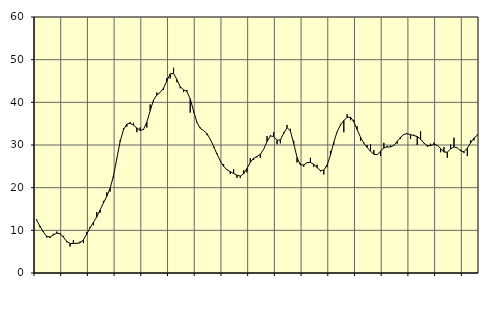
| Category | Piggar | Series 1 |
|---|---|---|
| nan | 12.6 | 12.34 |
| 87.0 | 10.7 | 10.99 |
| 87.0 | 9.8 | 9.62 |
| 87.0 | 8.3 | 8.6 |
| nan | 8.2 | 8.44 |
| 88.0 | 9.2 | 8.91 |
| 88.0 | 9.7 | 9.34 |
| 88.0 | 9.1 | 9.24 |
| nan | 8.7 | 8.41 |
| 89.0 | 7.2 | 7.41 |
| 89.0 | 6.2 | 6.91 |
| 89.0 | 7.7 | 6.91 |
| nan | 6.8 | 6.97 |
| 90.0 | 7.4 | 7.05 |
| 90.0 | 7 | 7.78 |
| 90.0 | 9.6 | 9.13 |
| nan | 10.8 | 10.58 |
| 91.0 | 11.2 | 11.87 |
| 91.0 | 14.3 | 13.16 |
| 91.0 | 14.1 | 14.77 |
| nan | 16.9 | 16.41 |
| 92.0 | 18.9 | 17.96 |
| 92.0 | 19.1 | 19.85 |
| 92.0 | 22.3 | 22.74 |
| nan | 26.7 | 26.79 |
| 93.0 | 31.1 | 30.8 |
| 93.0 | 33.9 | 33.57 |
| 93.0 | 34.3 | 34.88 |
| nan | 35.4 | 35.1 |
| 94.0 | 35.2 | 34.65 |
| 94.0 | 33 | 34 |
| 94.0 | 34.1 | 33.38 |
| nan | 33.5 | 33.66 |
| 95.0 | 34.1 | 35.36 |
| 95.0 | 39.5 | 38.02 |
| 95.0 | 40.2 | 40.53 |
| nan | 42.3 | 41.7 |
| 96.0 | 42.3 | 42.32 |
| 96.0 | 42.9 | 43.32 |
| 96.0 | 45.7 | 45.01 |
| nan | 45.6 | 46.67 |
| 97.0 | 48.1 | 46.8 |
| 97.0 | 44.7 | 45.34 |
| 97.0 | 43.3 | 43.65 |
| nan | 42.4 | 42.96 |
| 98.0 | 42.9 | 42.54 |
| 98.0 | 37.6 | 40.8 |
| 98.0 | 37.6 | 37.98 |
| nan | 35.4 | 35.29 |
| 99.0 | 34.1 | 33.92 |
| 99.0 | 33.4 | 33.38 |
| 99.0 | 32.3 | 32.67 |
| nan | 31.3 | 31.37 |
| 0.0 | 29.4 | 29.7 |
| 0.0 | 28.1 | 27.88 |
| 0.0 | 26.2 | 26.28 |
| nan | 25.5 | 24.98 |
| 1.0 | 24.3 | 24.17 |
| 1.0 | 23.2 | 23.75 |
| 1.0 | 24.3 | 23.31 |
| nan | 22.3 | 22.92 |
| 2.0 | 22.3 | 22.72 |
| 2.0 | 24.1 | 23.24 |
| 2.0 | 23.6 | 24.52 |
| nan | 26.9 | 25.93 |
| 3.0 | 26.5 | 26.91 |
| 3.0 | 27.1 | 27.3 |
| 3.0 | 27 | 27.82 |
| nan | 29 | 29.02 |
| 4.0 | 32.1 | 30.78 |
| 4.0 | 32.3 | 32.12 |
| 4.0 | 33 | 32 |
| nan | 30.2 | 31.09 |
| 5.0 | 30.4 | 31.21 |
| 5.0 | 33 | 32.73 |
| 5.0 | 34.7 | 34.08 |
| nan | 33.8 | 33.29 |
| 6.0 | 31 | 30.32 |
| 6.0 | 25.9 | 27.1 |
| 6.0 | 25.7 | 25.34 |
| nan | 24.9 | 25.33 |
| 7.0 | 25.9 | 25.88 |
| 7.0 | 27 | 25.92 |
| 7.0 | 24.9 | 25.5 |
| nan | 25.4 | 24.69 |
| 8.0 | 23.8 | 24.02 |
| 8.0 | 23.1 | 24.1 |
| 8.0 | 24.8 | 25.31 |
| nan | 28.6 | 27.6 |
| 9.0 | 30.1 | 30.63 |
| 9.0 | 33 | 33.09 |
| 9.0 | 34.9 | 34.67 |
| nan | 33 | 35.76 |
| 10.0 | 37.2 | 36.45 |
| 10.0 | 35.8 | 36.54 |
| 10.0 | 35.9 | 35.43 |
| nan | 34.4 | 33.62 |
| 11.0 | 31 | 31.84 |
| 11.0 | 30.6 | 30.4 |
| 11.0 | 30 | 29.43 |
| nan | 30.2 | 28.54 |
| 12.0 | 28.8 | 27.83 |
| 12.0 | 27.7 | 27.76 |
| 12.0 | 27.5 | 28.53 |
| nan | 30.5 | 29.32 |
| 13.0 | 29.8 | 29.55 |
| 13.0 | 29.9 | 29.53 |
| 13.0 | 29.8 | 29.92 |
| nan | 30.3 | 30.85 |
| 14.0 | 31.4 | 31.81 |
| 14.0 | 32.4 | 32.48 |
| 14.0 | 32.8 | 32.66 |
| nan | 31.4 | 32.43 |
| 15.0 | 32.4 | 32.2 |
| 15.0 | 30 | 32.01 |
| 15.0 | 33.2 | 31.38 |
| nan | 30.4 | 30.45 |
| 16.0 | 29.6 | 29.85 |
| 16.0 | 30.3 | 29.85 |
| 16.0 | 30.6 | 30.12 |
| nan | 30 | 29.95 |
| 17.0 | 28.3 | 29.19 |
| 17.0 | 29.5 | 28.34 |
| 17.0 | 27 | 28.33 |
| nan | 30.1 | 29.07 |
| 18.0 | 31.7 | 29.54 |
| 18.0 | 29.3 | 29.33 |
| 18.0 | 28.9 | 28.64 |
| nan | 28.1 | 28.42 |
| 19.0 | 27.4 | 29.25 |
| 19.0 | 31.1 | 30.52 |
| 19.0 | 31.1 | 31.62 |
| nan | 32.5 | 32.3 |